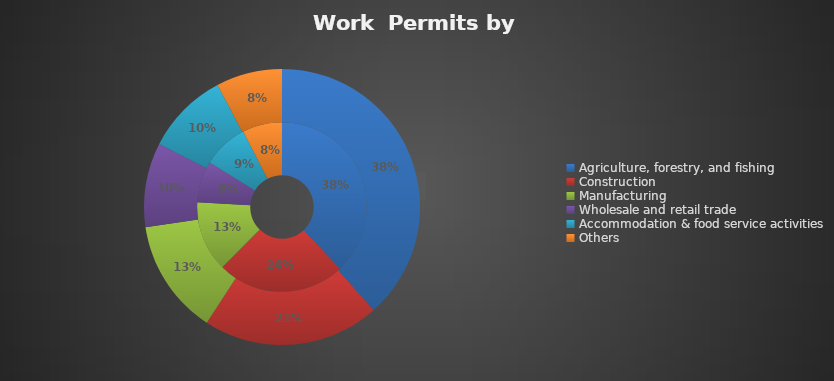
| Category | 2019 | Total |
|---|---|---|
| Agriculture, forestry, and fishing | 8073 | 57829 |
| Construction | 5183 | 31167 |
| Manufacturing | 2863 | 20292 |
| Wholesale and retail trade | 1673 | 14861 |
| Accommodation & food service activities | 1842 | 14613 |
| Others | 1605 | 11633 |